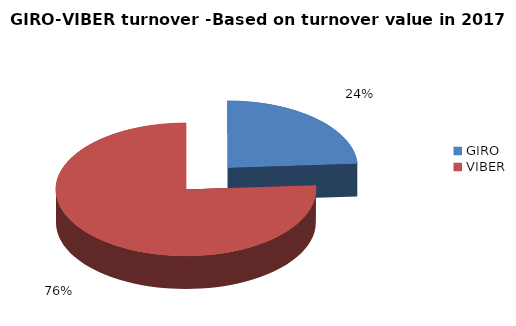
| Category | Forgalmi érték alapján 2016-ban |
|---|---|
| GIRO | 0.24 |
| VIBER | 0.76 |